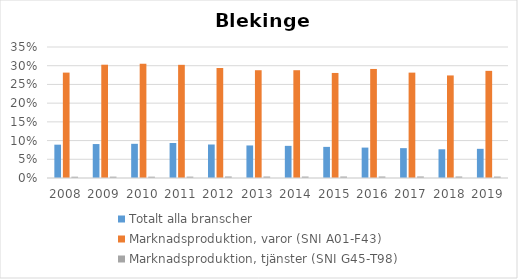
| Category | Totalt alla branscher | Marknadsproduktion, varor (SNI A01-F43) | Marknadsproduktion, tjänster (SNI G45-T98) |
|---|---|---|---|
| 2008.0 | 0.089 | 0.282 | 0.003 |
| 2009.0 | 0.091 | 0.303 | 0.004 |
| 2010.0 | 0.091 | 0.305 | 0.004 |
| 2011.0 | 0.094 | 0.302 | 0.004 |
| 2012.0 | 0.089 | 0.294 | 0.004 |
| 2013.0 | 0.087 | 0.288 | 0.004 |
| 2014.0 | 0.086 | 0.288 | 0.004 |
| 2015.0 | 0.083 | 0.281 | 0.004 |
| 2016.0 | 0.081 | 0.291 | 0.004 |
| 2017.0 | 0.08 | 0.282 | 0.004 |
| 2018.0 | 0.077 | 0.274 | 0.004 |
| 2019.0 | 0.078 | 0.286 | 0.004 |